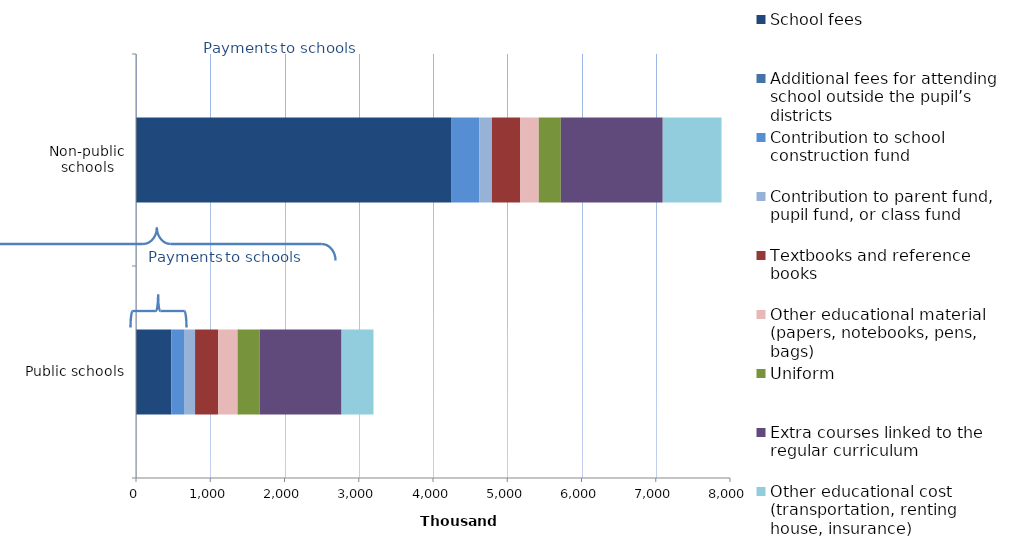
| Category | School fees | Additional fees for attending school outside the pupil’s districts | Contribution to school construction fund | Contribution to parent fund, pupil fund, or class fund | Textbooks and reference books | Other educational material (papers, notebooks, pens, bags) | Uniform | Extra courses linked to the regular curriculum | Other educational cost (transportation, renting house, insurance) |
|---|---|---|---|---|---|---|---|---|---|
| Public schools | 472.671 | 8.049 | 174.267 | 140.551 | 310.423 | 262.105 | 296.155 | 1104.256 | 430.014 |
| Non-public schools | 4243.603 | 10.255 | 367.975 | 172.412 | 381.503 | 248.401 | 297.41 | 1372.794 | 791.551 |